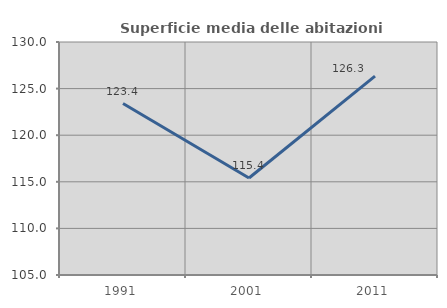
| Category | Superficie media delle abitazioni occupate |
|---|---|
| 1991.0 | 123.393 |
| 2001.0 | 115.408 |
| 2011.0 | 126.338 |